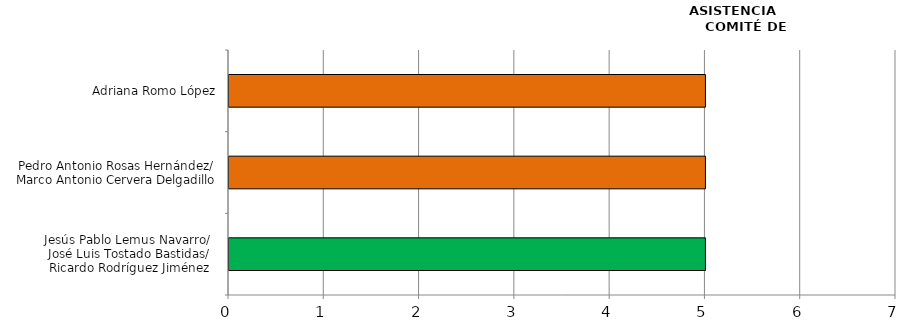
| Category | Series 0 |
|---|---|
| Jesús Pablo Lemus Navarro/ 
José Luis Tostado Bastidas/
Ricardo Rodríguez Jiménez | 5 |
| Pedro Antonio Rosas Hernández/
Marco Antonio Cervera Delgadillo | 5 |
| Adriana Romo López | 5 |